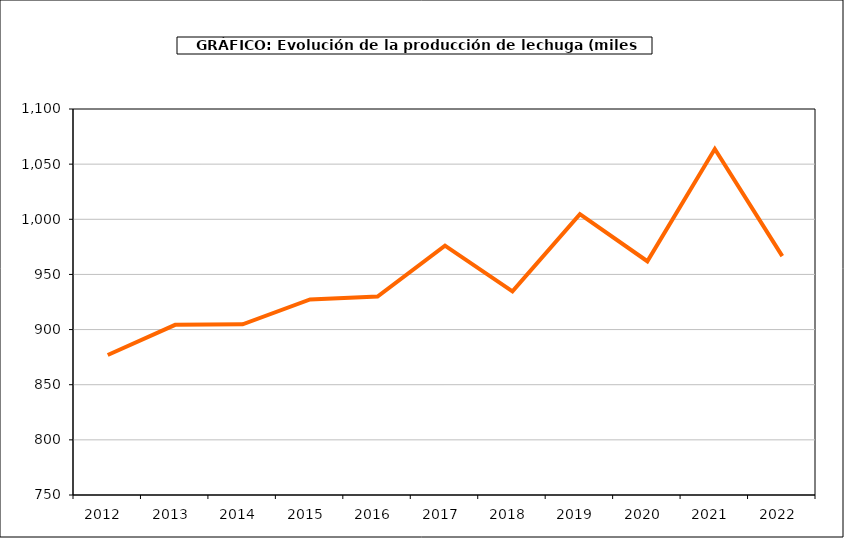
| Category | producción |
|---|---|
| 2012.0 | 876.926 |
| 2013.0 | 904.283 |
| 2014.0 | 904.802 |
| 2015.0 | 927.378 |
| 2016.0 | 929.944 |
| 2017.0 | 976.112 |
| 2018.0 | 934.67 |
| 2019.0 | 1004.668 |
| 2020.0 | 961.938 |
| 2021.0 | 1063.775 |
| 2022.0 | 966.543 |